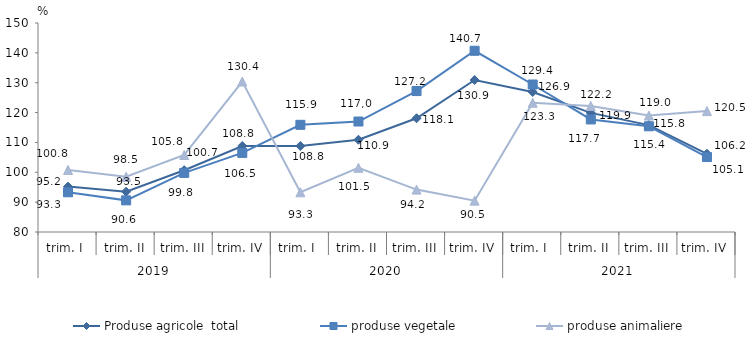
| Category | Produse agricole  total | produse vegetale | produse animaliere |
|---|---|---|---|
| 0 | 95.2 | 93.3 | 100.8 |
| 1 | 93.5 | 90.6 | 98.5 |
| 2 | 100.7 | 99.8 | 105.8 |
| 3 | 108.8 | 106.5 | 130.4 |
| 4 | 108.8 | 115.9 | 93.3 |
| 5 | 110.9 | 117 | 101.5 |
| 6 | 118.1 | 127.2 | 94.2 |
| 7 | 130.9 | 140.7 | 90.5 |
| 8 | 126.9 | 129.4 | 123.3 |
| 9 | 119.9 | 117.7 | 122.2 |
| 10 | 115.8 | 115.4 | 119 |
| 11 | 106.2 | 105.1 | 120.5 |